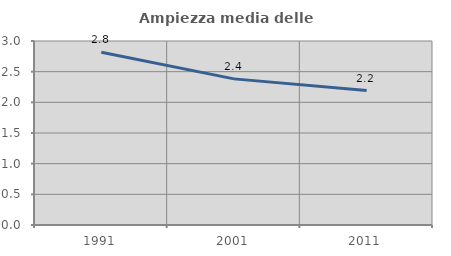
| Category | Ampiezza media delle famiglie |
|---|---|
| 1991.0 | 2.817 |
| 2001.0 | 2.382 |
| 2011.0 | 2.193 |